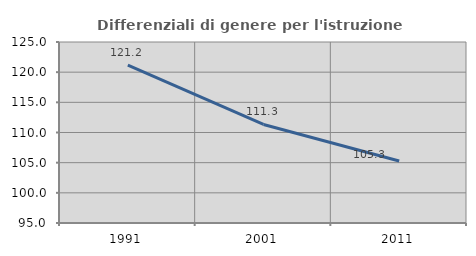
| Category | Differenziali di genere per l'istruzione superiore |
|---|---|
| 1991.0 | 121.162 |
| 2001.0 | 111.33 |
| 2011.0 | 105.276 |